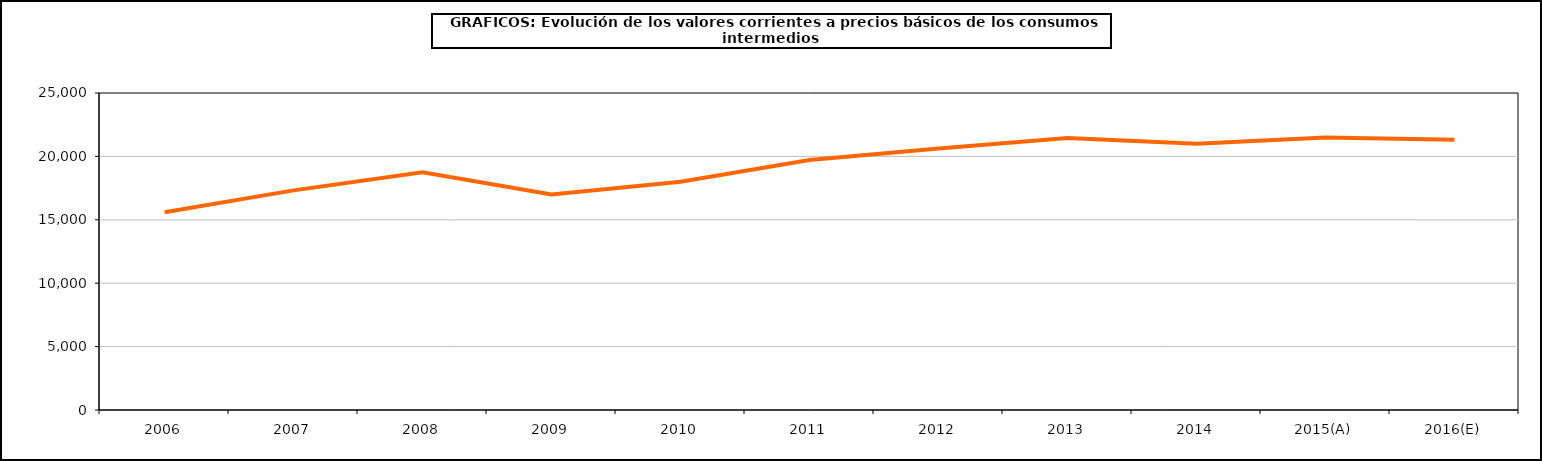
| Category | Total consumos intermedios |
|---|---|
| 2006 | 15598.3 |
| 2007 | 17320.3 |
| 2008 | 18741.8 |
| 2009 | 16992.3 |
| 2010 | 18005.1 |
| 2011 | 19714.8 |
| 2012 | 20625.1 |
| 2013 | 21445.2 |
| 2014 | 20997.8 |
| 2015(A) | 21495.5 |
| 2016(E) | 21310.3 |